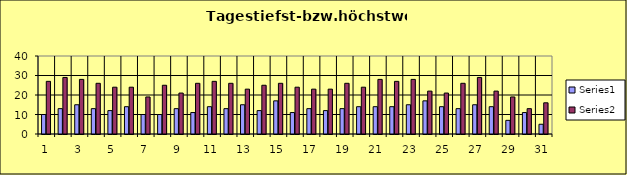
| Category | Series 0 | Series 1 |
|---|---|---|
| 0 | 10 | 27 |
| 1 | 13 | 29 |
| 2 | 15 | 28 |
| 3 | 13 | 26 |
| 4 | 12 | 24 |
| 5 | 14 | 24 |
| 6 | 10 | 19 |
| 7 | 10 | 25 |
| 8 | 13 | 21 |
| 9 | 11 | 26 |
| 10 | 14 | 27 |
| 11 | 13 | 26 |
| 12 | 15 | 23 |
| 13 | 12 | 25 |
| 14 | 17 | 26 |
| 15 | 11 | 24 |
| 16 | 13 | 23 |
| 17 | 12 | 23 |
| 18 | 13 | 26 |
| 19 | 14 | 24 |
| 20 | 14 | 28 |
| 21 | 14 | 27 |
| 22 | 15 | 28 |
| 23 | 17 | 22 |
| 24 | 14 | 21 |
| 25 | 13 | 26 |
| 26 | 15 | 29 |
| 27 | 14 | 22 |
| 28 | 7 | 19 |
| 29 | 11 | 13 |
| 30 | 5 | 16 |